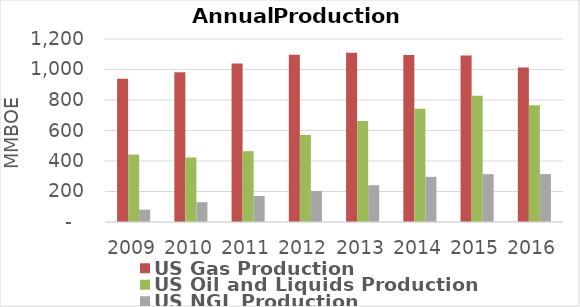
| Category | US Gas Production | US Oil and Liquids Production | US NGL Production |
|---|---|---|---|
| 2009 | 939.388 | 442.365 | 80.6 |
| 2010 | 982.418 | 423.215 | 129.957 |
| 2011 | 1039.232 | 464.552 | 170.596 |
| 2012 | 1096.084 | 570.723 | 203.837 |
| 2013 | 1109.032 | 662.058 | 241.054 |
| 2014 | 1095.368 | 742.968 | 296.468 |
| 2015 | 1091.036 | 827.709 | 313.507 |
| 2016 | 1012.777 | 765.125 | 314.049 |